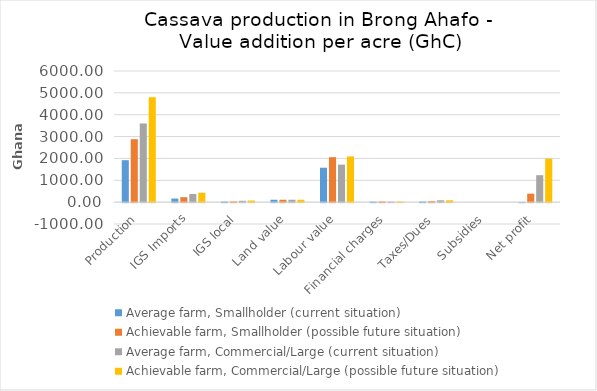
| Category | Average farm, Smallholder (current situation) | Achievable farm, Smallholder (possible future situation) | Average farm, Commercial/Large (current situation) | Achievable farm, Commercial/Large (possible future situation) |
|---|---|---|---|---|
| Production | 1920 | 2880 | 3600 | 4800 |
| IGS Imports | 163.767 | 226.25 | 374.475 | 429.891 |
| IGS local | 24.34 | 28.91 | 62.05 | 74.883 |
| Land value | 110 | 110 | 110 | 110 |
| Labour value | 1574.635 | 2057.042 | 1716.377 | 2091.838 |
| Financial charges | 21.424 | 29.136 | 21 | 21 |
| Taxes/Dues | 27.18 | 40.171 | 83.915 | 83.915 |
| Subsidies | 0 | 0 | 0 | 0 |
| Net profit | -1.346 | 388.491 | 1232.183 | 1988.473 |